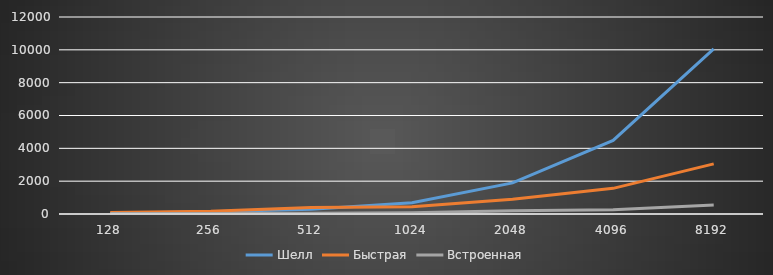
| Category | Шелл | Быстрая | Встроенная |
|---|---|---|---|
| 128.0 | 47.667 | 87 | 27.333 |
| 256.0 | 136.333 | 172.333 | 23.667 |
| 512.0 | 288 | 393.667 | 46 |
| 1024.0 | 688 | 447 | 73.333 |
| 2048.0 | 1894 | 902.333 | 201 |
| 4096.0 | 4481.667 | 1563 | 257 |
| 8192.0 | 10060.667 | 3053 | 541.667 |